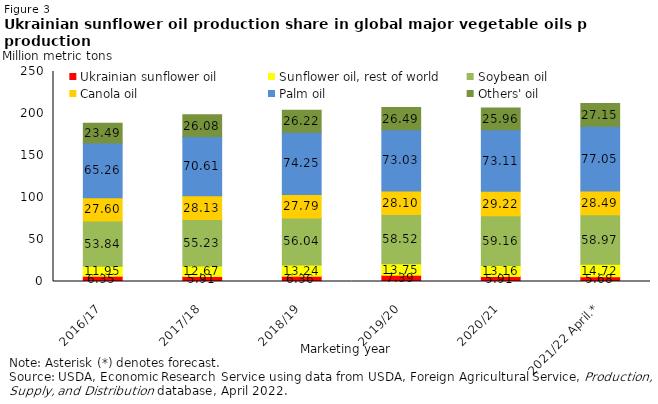
| Category | Ukrainian sunflower oil | Sunflower oil, rest of world | Soybean oil  | Canola oil  | Palm oil  | Others' oil |
|---|---|---|---|---|---|---|
| 2016/17 | 6.351 | 11.949 | 53.84 | 27.603 | 65.262 | 23.487 |
| 2017/18 | 5.913 | 12.665 | 55.232 | 28.133 | 70.606 | 26.082 |
| 2018/19 | 6.364 | 13.236 | 56.04 | 27.794 | 74.249 | 26.22 |
| 2019/20 | 7.39 | 13.749 | 58.523 | 28.101 | 73.031 | 26.485 |
| 2020/21 | 5.913 | 13.157 | 59.155 | 29.217 | 73.105 | 25.96 |
| 2021/22 April.* | 5.676 | 14.717 | 58.968 | 28.485 | 77.047 | 27.147 |